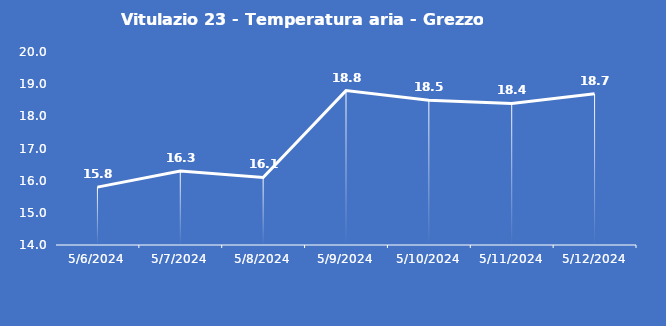
| Category | Vitulazio 23 - Temperatura aria - Grezzo (°C) |
|---|---|
| 5/6/24 | 15.8 |
| 5/7/24 | 16.3 |
| 5/8/24 | 16.1 |
| 5/9/24 | 18.8 |
| 5/10/24 | 18.5 |
| 5/11/24 | 18.4 |
| 5/12/24 | 18.7 |